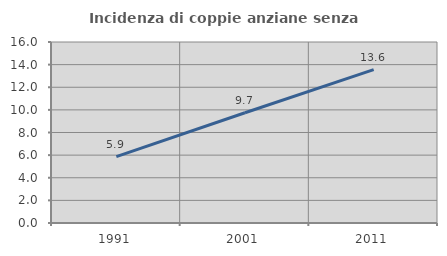
| Category | Incidenza di coppie anziane senza figli  |
|---|---|
| 1991.0 | 5.863 |
| 2001.0 | 9.743 |
| 2011.0 | 13.561 |